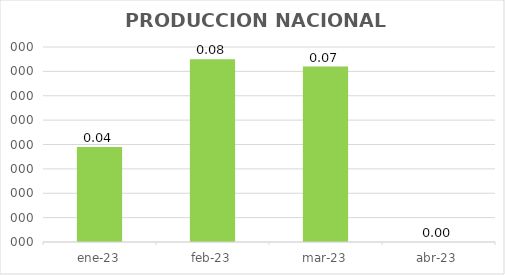
| Category | PRODUCCION NACIONAL |
|---|---|
| ene-23 | 0.039 |
| feb-23 | 0.075 |
| mar-23 | 0.072 |
| abr-23 | 0 |